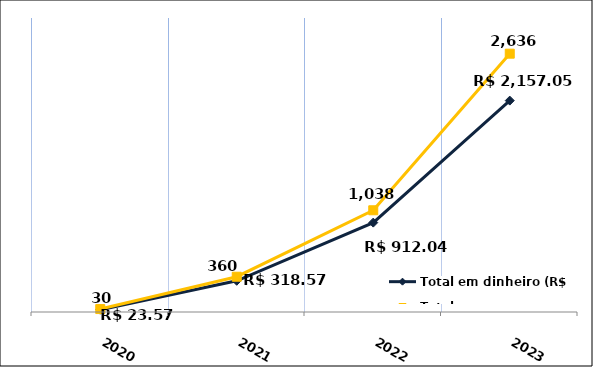
| Category | Total em dinheiro (R$) |
|---|---|
| 2020.0 | 23.57 |
| 2021.0 | 318.57 |
| 2022.0 | 912.04 |
| 2023.0 | 2157.05 |